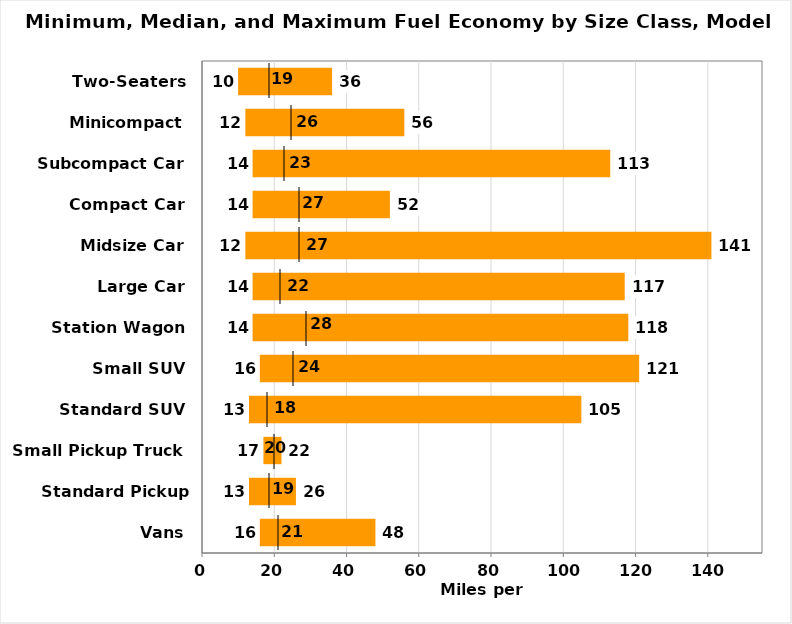
| Category | Filler | Bar | Total |
|---|---|---|---|
| Vans | 16 | 32 | 48 |
| Standard Pickup Truck | 13 | 13 | 26 |
| Small Pickup Truck | 17 | 5 | 22 |
| Standard SUV | 13 | 92 | 105 |
| Small SUV | 16 | 105 | 121 |
| Station Wagon | 14 | 104 | 118 |
| Large Car | 14 | 103 | 117 |
| Midsize Car | 12 | 129 | 141 |
| Compact Car | 14 | 38 | 52 |
| Subcompact Car | 14 | 99 | 113 |
| Minicompact | 12 | 44 | 56 |
| Two-Seaters | 10 | 26 | 36 |